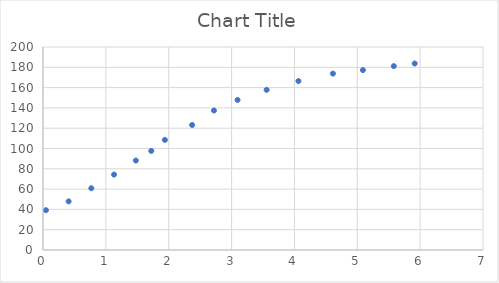
| Category | Series 0 |
|---|---|
| 5.91329479768786 | 183.75 |
| 5.58092485549132 | 181.154 |
| 5.08959537572254 | 177.26 |
| 4.61271676300578 | 173.798 |
| 4.0635838150289 | 166.442 |
| 3.55780346820809 | 157.788 |
| 3.09537572254335 | 147.837 |
| 2.71965317919075 | 137.452 |
| 2.37283236994219 | 123.173 |
| 1.9393063583815 | 108.462 |
| 1.72254335260115 | 97.644 |
| 1.47687861271676 | 88.125 |
| 1.1300578034682 | 74.279 |
| 0.76878612716763 | 60.865 |
| 0.407514450867052 | 47.885 |
| 0.0462427745664739 | 39.231 |